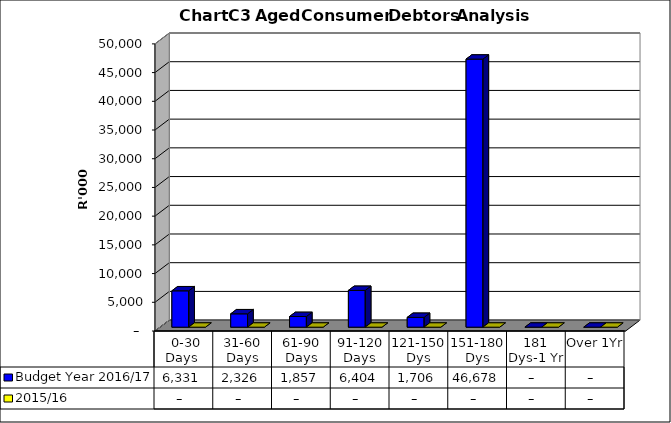
| Category | Budget Year 2016/17 | 2015/16 |
|---|---|---|
|  0-30 Days  | 6331008 | 0 |
| 31-60 Days | 2326067 | 0 |
| 61-90 Days | 1856512 | 0 |
| 91-120 Days | 6403840 | 0 |
| 121-150 Dys | 1705735 | 0 |
| 151-180 Dys | 46678436 | 0 |
| 181 Dys-1 Yr | 0 | 0 |
| Over 1Yr | 0 | 0 |